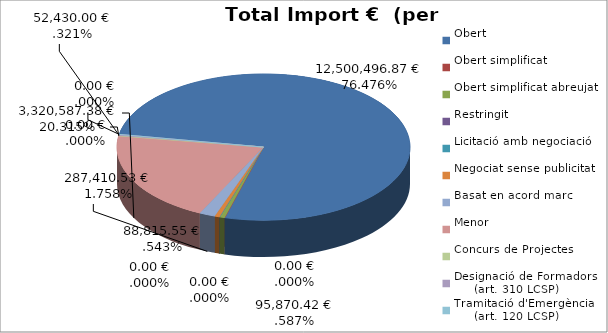
| Category | Total preu
(amb IVA) |
|---|---|
| Obert | 12500496.87 |
| Obert simplificat | 0 |
| Obert simplificat abreujat | 95870.42 |
| Restringit | 0 |
| Licitació amb negociació | 0 |
| Negociat sense publicitat | 88815.55 |
| Basat en acord marc | 287410.53 |
| Menor | 3320587.38 |
| Concurs de Projectes | 0 |
| Designació de Formadors
     (art. 310 LCSP) | 52430 |
| Tramitació d'Emergència
     (art. 120 LCSP) | 0 |